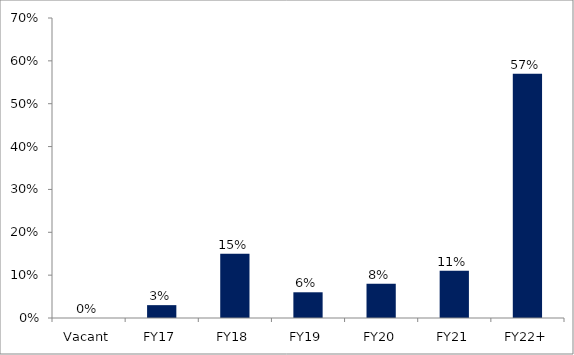
| Category | Series 0 |
|---|---|
| Vacant | 0 |
| FY17 | 0.03 |
| FY18 | 0.15 |
| FY19 | 0.06 |
| FY20 | 0.08 |
| FY21 | 0.11 |
| FY22+ | 0.57 |